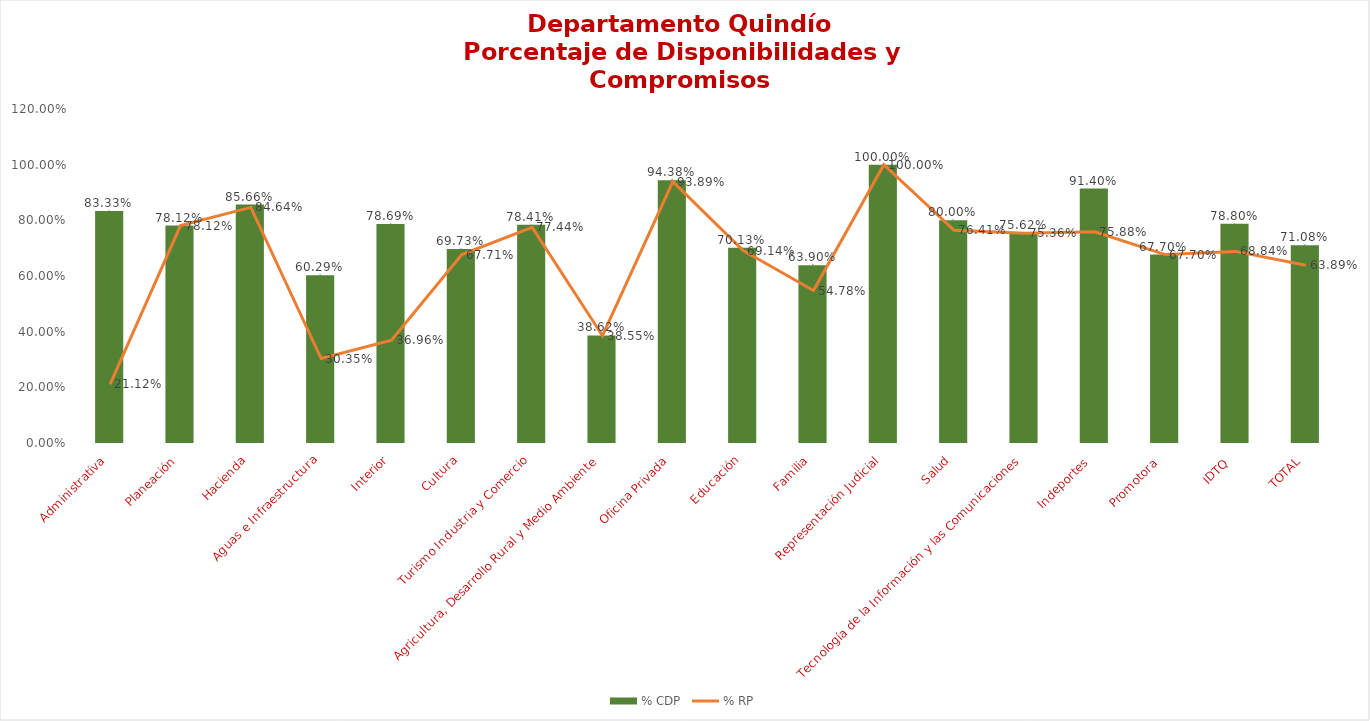
| Category | % CDP |
|---|---|
| Administrativa | 0.833 |
| Planeación | 0.781 |
| Hacienda | 0.857 |
| Aguas e Infraestructura | 0.603 |
| Interior | 0.787 |
| Cultura | 0.697 |
| Turismo Industria y Comercio | 0.784 |
| Agricultura, Desarrollo Rural y Medio Ambiente | 0.386 |
| Oficina Privada | 0.944 |
| Educación | 0.701 |
| Familia | 0.639 |
| Representación Judicial | 1 |
| Salud | 0.8 |
| Tecnología de la Información y las Comunicaciones | 0.756 |
| Indeportes | 0.914 |
| Promotora | 0.677 |
| IDTQ | 0.788 |
| TOTAL | 0.711 |